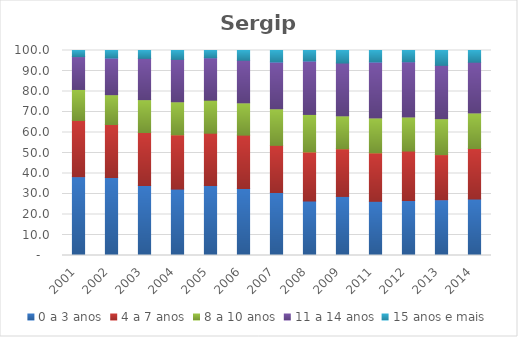
| Category | 0 a 3 anos | 4 a 7 anos | 8 a 10 anos | 11 a 14 anos | 15 anos e mais |
|---|---|---|---|---|---|
| 2001.0 | 38.46 | 27.42 | 15.12 | 16.03 | 2.98 |
| 2002.0 | 38.03 | 25.88 | 14.53 | 17.91 | 3.65 |
| 2003.0 | 34.14 | 25.86 | 16.03 | 20.12 | 3.85 |
| 2004.0 | 32.4 | 26.48 | 16.1 | 20.68 | 4.35 |
| 2005.0 | 34.13 | 25.52 | 16.11 | 20.69 | 3.55 |
| 2006.0 | 32.67 | 26.04 | 15.75 | 20.78 | 4.76 |
| 2007.0 | 30.74 | 22.99 | 17.85 | 22.82 | 5.6 |
| 2008.0 | 26.58 | 23.94 | 18.3 | 26.08 | 5.1 |
| 2009.0 | 28.81 | 23.25 | 16.06 | 25.77 | 6.1 |
| 2011.0 | 26.43 | 23.64 | 17.03 | 27.3 | 5.6 |
| 2012.0 | 26.81 | 24.14 | 16.62 | 26.94 | 5.48 |
| 2013.0 | 27.2 | 22.02 | 17.52 | 26.02 | 7.24 |
| 2014.0 | 27.55 | 24.63 | 17.36 | 24.74 | 5.72 |